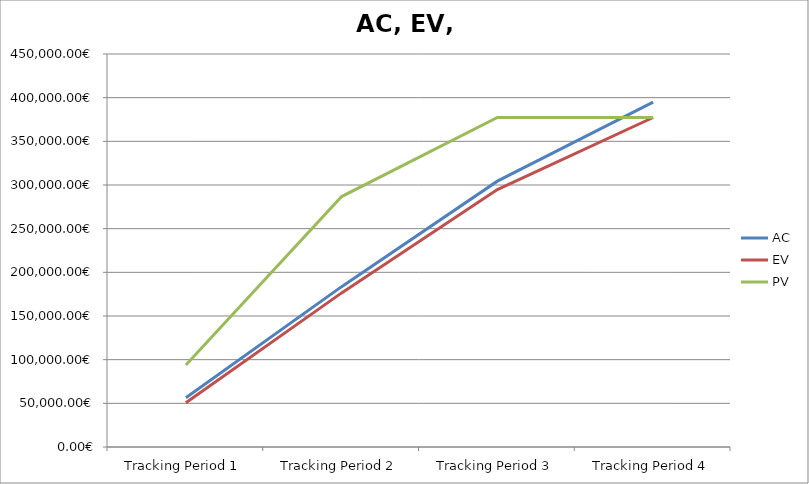
| Category | AC | EV | PV |
|---|---|---|---|
| Tracking Period 1 | 56288 | 50723 | 93796 |
| Tracking Period 2 | 183621 | 176468 | 286751 |
| Tracking Period 3 | 304393 | 294798 | 377282 |
| Tracking Period 4 | 394829 | 377282 | 377282 |